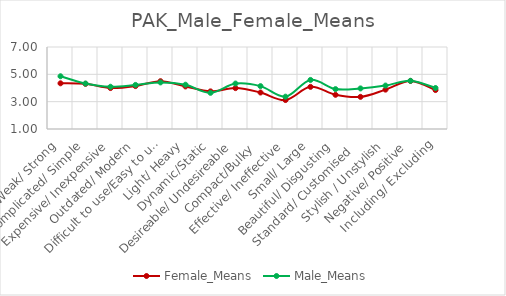
| Category | Female_Means | Male_Means |
|---|---|---|
| Weak/ Strong | 4.344 | 4.859 |
| Complicated/ Simple | 4.304 | 4.328 |
| Expensive/ Inexpensive | 3.996 | 4.091 |
| Outdated/ Modern | 4.141 | 4.225 |
| Difficult to use/Easy to use | 4.498 | 4.409 |
| Light/ Heavy | 4.115 | 4.241 |
| Dynamic/Static | 3.753 | 3.647 |
| Desireable/ Undesireable | 3.991 | 4.325 |
| Compact/Bulky  | 3.67 | 4.138 |
| Effective/ Ineffective | 3.119 | 3.366 |
| Small/ Large | 4.084 | 4.591 |
| Beautiful/ Disgusting | 3.502 | 3.919 |
| Standard/ Customised   | 3.352 | 3.969 |
| Stylish / Unstylish | 3.881 | 4.178 |
| Negative/ Positive | 4.515 | 4.528 |
| Including/ Excluding | 3.85 | 4 |